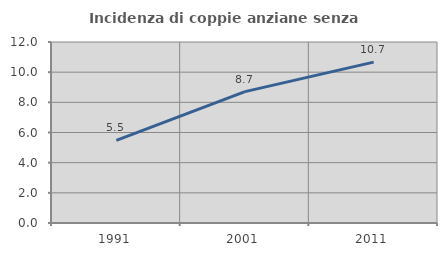
| Category | Incidenza di coppie anziane senza figli  |
|---|---|
| 1991.0 | 5.481 |
| 2001.0 | 8.71 |
| 2011.0 | 10.665 |